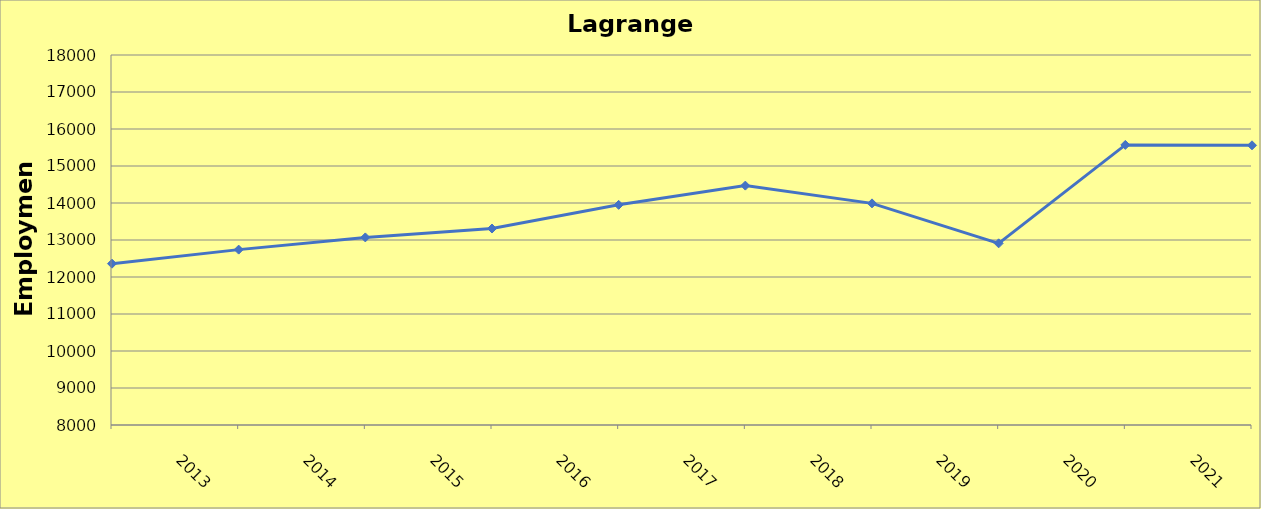
| Category | Lagrange County |
|---|---|
| 2013.0 | 12360 |
| 2014.0 | 12740 |
| 2015.0 | 13070 |
| 2016.0 | 13310 |
| 2017.0 | 13950 |
| 2018.0 | 14470 |
| 2019.0 | 13990 |
| 2020.0 | 12910 |
| 2021.0 | 15570 |
| 2022.0 | 15559 |